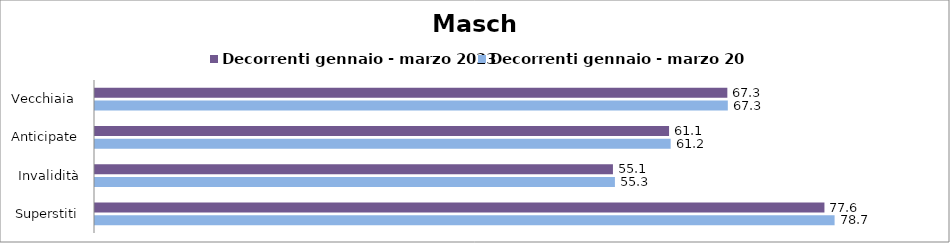
| Category | Decorrenti gennaio - marzo 2023 | Decorrenti gennaio - marzo 2024 |
|---|---|---|
| Vecchiaia  | 67.27 | 67.32 |
| Anticipate | 61.07 | 61.24 |
| Invalidità | 55.1 | 55.31 |
| Superstiti | 77.6 | 78.68 |